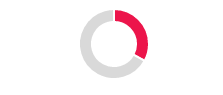
| Category | series1 |
|---|---|
| 0 | 0.33 |
| 1 | 0.67 |